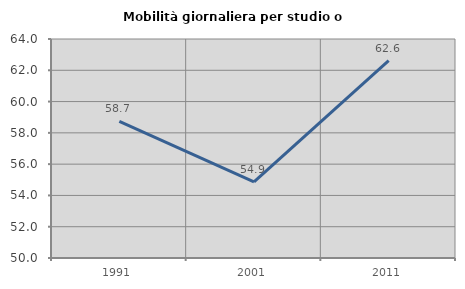
| Category | Mobilità giornaliera per studio o lavoro |
|---|---|
| 1991.0 | 58.741 |
| 2001.0 | 54.868 |
| 2011.0 | 62.615 |